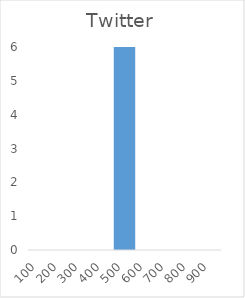
| Category | Series 0 |
|---|---|
| 100.0 | 0 |
| 200.0 | 0 |
| 300.0 | 0 |
| 400.0 | 0 |
| 500.0 | 6 |
| 600.0 | 0 |
| 700.0 | 0 |
| 800.0 | 0 |
| 900.0 | 0 |